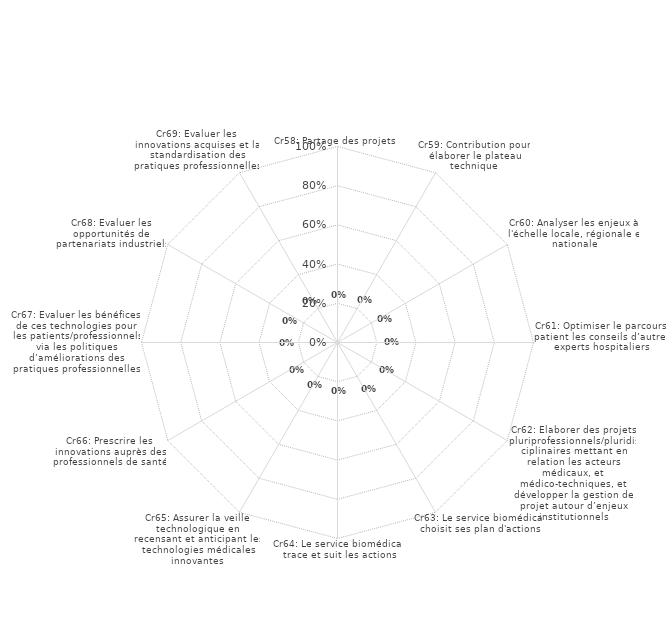
| Category | Graphes RADAR pour Résultats Globaux BPR |
|---|---|
| Cr58: Partage des projets  | 0 |
| Cr59: Contribution pour élaborer le plateau technique | 0 |
| Cr60: Analyser les enjeux à l'échelle locale, régionale et nationale | 0 |
| Cr61: Optimiser le parcours patient les conseils d’autres experts hospitaliers | 0 |
| Cr62: Elaborer des projets pluriprofessionnels/pluridisciplinaires mettant en relation les acteurs médicaux, et médico-techniques, et développer la gestion de projet autour d’enjeux institutionnels | 0 |
| Cr63: Le service biomédical choisit ses plan d'actions | 0 |
| Cr64: Le service biomédical trace et suit les actions | 0 |
| Cr65: Assurer la veille technologique en recensant et anticipant les technologies médicales innovantes | 0 |
| Cr66: Prescrire les innovations auprès des professionnels de santé | 0 |
| Cr67: Evaluer les bénéfices de ces technologies pour les patients/professionnels via les politiques d’améliorations des pratiques professionnelles | 0 |
| Cr68: Evaluer les opportunités de partenariats industriels | 0 |
| Cr69: Evaluer les innovations acquises et la standardisation des pratiques professionnelles | 0 |